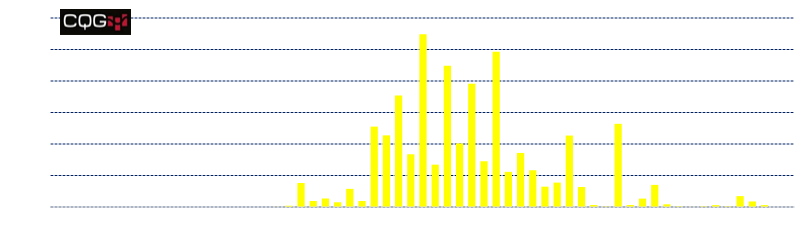
| Category | Series 0 |
|---|---|
| 3700 | 0 |
| 3750 | 0 |
| 3800 | 0 |
| 3850 | 0 |
| 3900 | 0 |
| 3950 | 0 |
| 4000 | 0 |
| 4050 | 0 |
| 4100 | 0 |
| 4150 | 0 |
| 4200 | 0 |
| 4250 | 0 |
| 4300 | 0 |
| 4350 | 0 |
| 4400 | 0 |
| 4450 | 0 |
| 4500 | 0 |
| 4550 | 0 |
| 4600 | 2 |
| 4650 | 20 |
| 4700 | 381 |
| 4750 | 95 |
| 4800 | 135 |
| 4850 | 75 |
| 4900 | 288 |
| 4950 | 95 |
| 5000 | 1276 |
| 5050 | 1137 |
| 5100 | 1771 |
| 5150 | 837 |
| 5200 | 2743 |
| 5250 | 672 |
| 5300 | 2242 |
| 5350 | 1009 |
| 5400 | 1957 |
| 5450 | 726 |
| 5500 | 2464 |
| 5550 | 558 |
| 5600 | 858 |
| 5650 | 583 |
| 5700 | 323 |
| 5750 | 387 |
| 5800 | 1134 |
| 5850 | 318 |
| 5900 | 32 |
| 5950 | 8 |
| 6000 | 1320 |
| 6050 | 32 |
| 6100 | 133 |
| 6150 | 351 |
| 6200 | 43 |
| 6250 | 11 |
| 6300 | 2 |
| 6350 | 10 |
| 6400 | 30 |
| 6450 | 10 |
| 6500 | 173 |
| 6550 | 88 |
| 6600 | 30 |
| 6650 | 0 |
| 6700 | 0 |